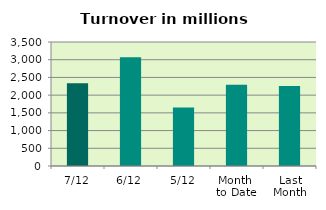
| Category | Series 0 |
|---|---|
| 7/12 | 2336.289 |
| 6/12 | 3067.039 |
| 5/12 | 1654.411 |
| Month 
to Date | 2295.757 |
| Last
Month | 2254.707 |